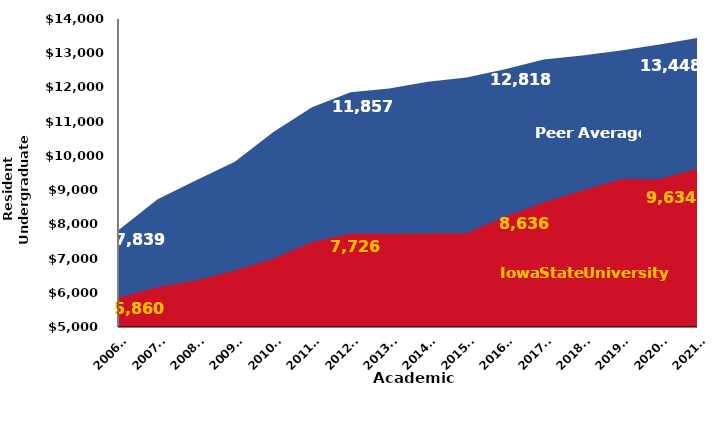
| Category | Peer Average | Iowa State University |
|---|---|---|
| 2006-
07 | 7839.415 | 5860 |
| 2007-
08 | 8734.088 | 6161.32 |
| 2008-
09 | 9289.001 | 6360 |
| 2009-
10 | 9830.583 | 6651 |
| 2010-
11 | 10698.1 | 6997 |
| 2011-
12 | 11423.4 | 7486 |
| 2012-
13 | 11856.7 | 7726 |
| 2013-
14 | 11970.78 | 7726 |
| 2014-
15 | 12168.48 | 7731.4 |
| 2015-
16 | 12290.456 | 7735.9 |
| 2016-
17 | 12528.628 | 8219.4 |
| 2017-
18 | 12817.8 | 8635.9 |
| 2018-
19 | 12935.492 | 8988.4 |
| 2019-
20 | 13077.572 | 9319.9 |
| 2020-
21 | 13252 | 9316 |
| 2021-
22 | 13447.912 | 9633.9 |